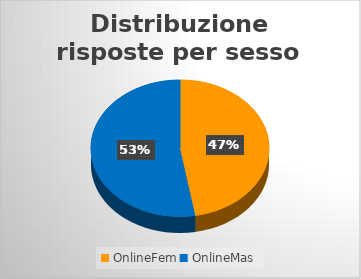
| Category | Series 0 |
|---|---|
| OnlineFem | 43 |
| OnlineMas | 48 |